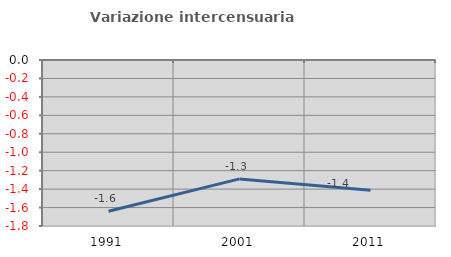
| Category | Variazione intercensuaria annua |
|---|---|
| 1991.0 | -1.641 |
| 2001.0 | -1.289 |
| 2011.0 | -1.412 |